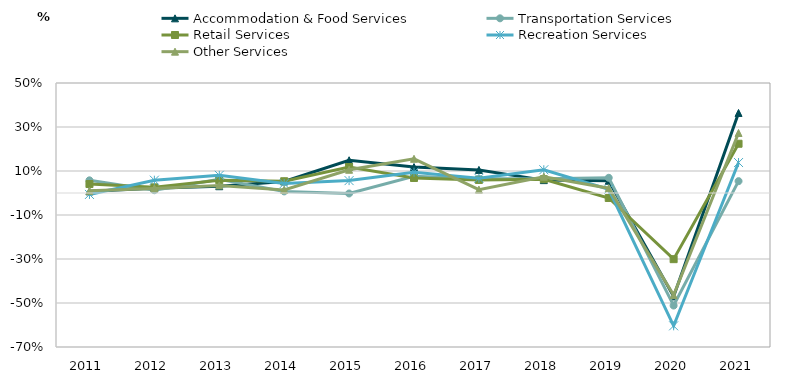
| Category | Accommodation & Food Services | Transportation Services | Retail Services | Recreation Services | Other Services |
|---|---|---|---|---|---|
| 2011.0 | 0.007 | 0.058 | 0.041 | -0.007 | 0.01 |
| 2012.0 | 0.021 | 0.013 | 0.026 | 0.058 | 0.021 |
| 2013.0 | 0.031 | 0.063 | 0.058 | 0.08 | 0.035 |
| 2014.0 | 0.053 | 0.007 | 0.053 | 0.043 | 0.014 |
| 2015.0 | 0.149 | -0.002 | 0.118 | 0.056 | 0.106 |
| 2016.0 | 0.118 | 0.076 | 0.068 | 0.095 | 0.156 |
| 2017.0 | 0.105 | 0.065 | 0.059 | 0.067 | 0.015 |
| 2018.0 | 0.059 | 0.065 | 0.063 | 0.106 | 0.074 |
| 2019.0 | 0.056 | 0.069 | -0.023 | 0.017 | 0.022 |
| 2020.0 | -0.47 | -0.512 | -0.301 | -0.604 | -0.464 |
| 2021.0 | 0.364 | 0.054 | 0.224 | 0.138 | 0.273 |